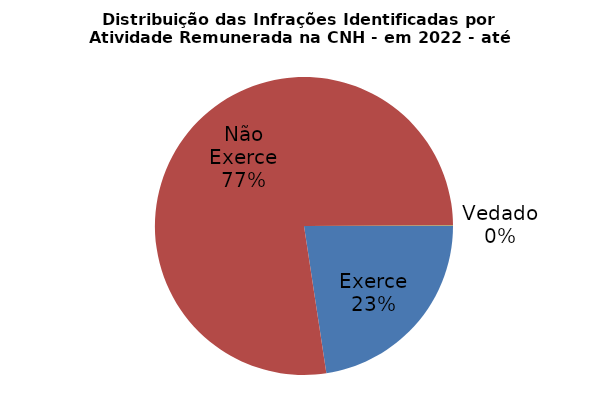
| Category | Series 0 |
|---|---|
| Exerce | 0.226 |
| Não Exerce | 0.773 |
| Vedado | 0.001 |